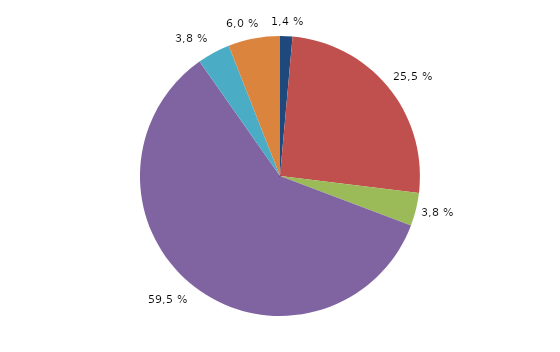
| Category | Series 0 |
|---|---|
| Selbständige | 303 |
| Arbeitnehmer (Arbeiter, Angestellte, Beamte) | 5391 |
| Arbeitslose | 806 |
| Rentner, Pensionäre | 12578 |
| Studierende, Auszubildende mit Einkommen nach § 14 Absatz 2 Nummern 27-29 WoGG | 798 |
| sonstige | 1262 |